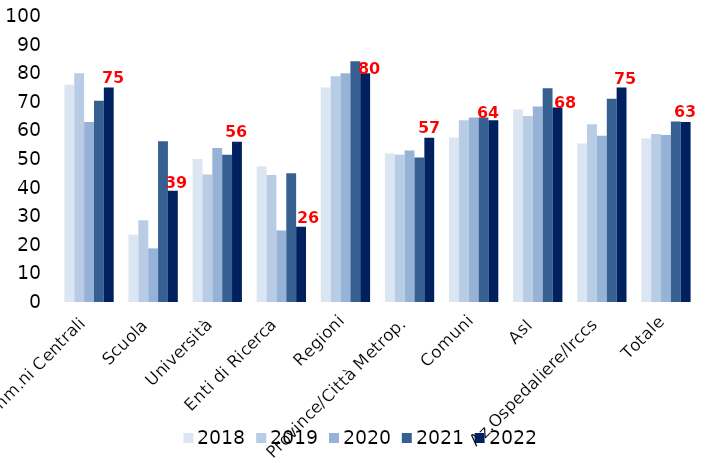
| Category | 2018 | 2019 | 2020 | 2021 | 2022 |
|---|---|---|---|---|---|
| Amm.ni Centrali | 76 | 80 | 62.963 | 70.37 | 75 |
| Scuola | 23.529 | 28.571 | 18.75 | 56.25 | 38.889 |
| Università | 50 | 44.615 | 53.846 | 51.515 | 56.061 |
| Enti di Ricerca | 47.368 | 44.444 | 25 | 45 | 26.316 |
| Regioni | 75 | 78.947 | 80 | 84.211 | 80 |
| Province/Città Metrop. | 51.961 | 51.485 | 52.941 | 50.495 | 57.426 |
| Comuni | 57.547 | 63.551 | 64.486 | 64.486 | 63.551 |
| Asl | 67.327 | 65 | 68.367 | 74.747 | 68.041 |
| Az.Ospedaliere/Irccs | 55.405 | 62.162 | 58.108 | 71.053 | 75 |
| Totale | 57.17 | 58.7 | 58.412 | 63.089 | 62.97 |